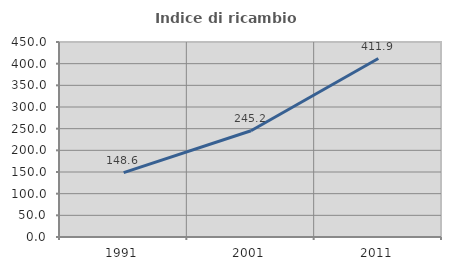
| Category | Indice di ricambio occupazionale  |
|---|---|
| 1991.0 | 148.611 |
| 2001.0 | 245.238 |
| 2011.0 | 411.905 |